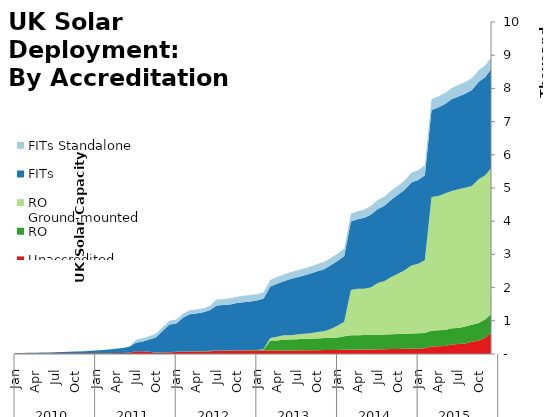
| Category | Unaccredited | RO | RO Ground-mounted | FITs | FITs Standalone |
|---|---|---|---|---|---|
| 0 | 15.944 | 2.177 | 0 | 12.896 | 0.01 |
| 1 | 16.303 | 2.186 | 0 | 13.909 | 0.01 |
| 2 | 16.895 | 2.2 | 0 | 15.856 | 0.018 |
| 3 | 17.307 | 2.218 | 0 | 18.072 | 0.025 |
| 4 | 17.945 | 2.225 | 0 | 21.715 | 0.043 |
| 5 | 18.339 | 2.243 | 0 | 26.129 | 0.817 |
| 6 | 19.158 | 2.258 | 0 | 31.212 | 0.819 |
| 7 | 19.65 | 2.265 | 0 | 36.47 | 0.858 |
| 8 | 20.295 | 2.272 | 0 | 43.335 | 0.872 |
| 9 | 21.259 | 2.288 | 0 | 51.794 | 0.897 |
| 10 | 22.356 | 2.293 | 0 | 61.249 | 0.939 |
| 11 | 22.949 | 2.314 | 0 | 68.596 | 1.019 |
| 12 | 23.984 | 2.322 | 0 | 78.728 | 1.023 |
| 13 | 24.989 | 2.327 | 0 | 91.066 | 1.064 |
| 14 | 26.113 | 2.349 | 0 | 109.618 | 1.184 |
| 15 | 26.909 | 2.369 | 0 | 127.924 | 1.323 |
| 16 | 27.976 | 2.4 | 0 | 150.431 | 1.423 |
| 17 | 36.269 | 2.445 | 0 | 182.468 | 2.181 |
| 18 | 81.208 | 2.47 | 0 | 252.117 | 92.529 |
| 19 | 81.83 | 2.505 | 0 | 295.499 | 93.273 |
| 20 | 64.682 | 2.581 | 0 | 369.245 | 99.129 |
| 21 | 39.449 | 2.626 | 0 | 461.513 | 111.281 |
| 22 | 45.193 | 2.715 | 0 | 651.808 | 112.505 |
| 23 | 53.589 | 7.698 | 0 | 829.023 | 114.498 |
| 24 | 60.751 | 7.877 | 0 | 852.257 | 114.531 |
| 25 | 66.476 | 7.999 | 0 | 1019.574 | 115.092 |
| 26 | 73.156 | 9.17 | 0 | 1118.351 | 120.388 |
| 27 | 75.345 | 9.325 | 0 | 1133.523 | 120.388 |
| 28 | 77.914 | 9.557 | 0 | 1166.762 | 120.447 |
| 29 | 85.939 | 9.759 | 0 | 1219.114 | 130.424 |
| 30 | 96.56 | 9.894 | 0 | 1351.509 | 186.741 |
| 31 | 98.114 | 10.314 | 0 | 1364.923 | 186.741 |
| 32 | 99.753 | 10.64 | 0 | 1382.262 | 186.745 |
| 33 | 102.062 | 11.254 | 0 | 1424.298 | 186.748 |
| 34 | 104.209 | 11.935 | 0 | 1445.117 | 190.134 |
| 35 | 106.022 | 12.395 | 0 | 1465.551 | 190.134 |
| 36 | 106.939 | 13.533 | 2.236 | 1489.08 | 190.134 |
| 37 | 107.964 | 29.721 | 15.33 | 1515.906 | 190.149 |
| 38 | 104.589 | 302.612 | 75.377 | 1547.975 | 194.987 |
| 39 | 105.877 | 303.908 | 112.763 | 1593.718 | 201.762 |
| 40 | 106.283 | 329.392 | 127.963 | 1629.766 | 201.768 |
| 41 | 107.22 | 330.764 | 127.963 | 1694.943 | 203.013 |
| 42 | 108.68 | 334.747 | 143.588 | 1723.033 | 206.917 |
| 43 | 110.725 | 345.182 | 150.825 | 1758.822 | 211.58 |
| 44 | 114.312 | 347.411 | 165.89 | 1793.485 | 212.69 |
| 45 | 116.545 | 349.724 | 194.798 | 1829.963 | 219.278 |
| 46 | 119.384 | 364.733 | 199.773 | 1872.48 | 219.282 |
| 47 | 122.481 | 366.505 | 266.439 | 1914.33 | 222.662 |
| 48 | 123.967 | 370.179 | 356.465 | 1947.582 | 222.662 |
| 49 | 126.905 | 411.212 | 430.897 | 1983.763 | 228.475 |
| 50 | 128.648 | 432.58 | 1370.075 | 2062.495 | 238.002 |
| 51 | 130.745 | 434.538 | 1397.269 | 2097.203 | 242.996 |
| 52 | 133.081 | 436.87 | 1397.845 | 2132.477 | 254.264 |
| 53 | 137.84 | 438.863 | 1433.438 | 2188.608 | 264.09 |
| 54 | 141.32 | 440.983 | 1555.63 | 2231.328 | 269.021 |
| 55 | 143.694 | 444.513 | 1607.419 | 2273.474 | 272.639 |
| 56 | 148.19 | 447.401 | 1724.847 | 2324.538 | 275.052 |
| 57 | 152.407 | 450.288 | 1814.153 | 2378.513 | 275.34 |
| 58 | 156.37 | 452.517 | 1912.01 | 2427.68 | 277.744 |
| 59 | 159.829 | 455.292 | 2052.961 | 2496.401 | 294.504 |
| 60 | 164.208 | 463.692 | 2090.809 | 2523.513 | 294.504 |
| 61 | 169.648 | 465.872 | 2191.733 | 2558.074 | 298.246 |
| 62 | 225.594 | 474.006 | 4027.157 | 2625.133 | 331.921 |
| 63 | 233.386 | 480.488 | 4048.76 | 2660.17 | 331.981 |
| 64 | 241.78 | 482.436 | 4107.655 | 2698.177 | 334.634 |
| 65 | 288.838 | 484.978 | 4139.396 | 2758.691 | 341.856 |
| 66 | 298.964 | 486.718 | 4173.952 | 2795.319 | 350.996 |
| 67 | 316.75 | 510.288 | 4183.793 | 2831.635 | 351 |
| 68 | 365.659 | 513.041 | 4183.793 | 2891.599 | 351.027 |
| 69 | 397.028 | 537.689 | 4330.701 | 2929.086 | 351.031 |
| 70 | 490.486 | 554.097 | 4337.905 | 2964.552 | 351.031 |
| 71 | 658.346 | 566.113 | 4407.859 | 2981.392 | 351.031 |